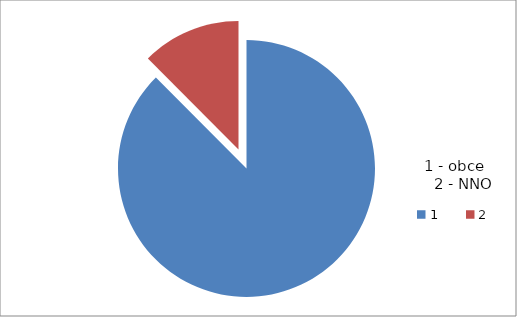
| Category | Series 0 |
|---|---|
| 0 | 87.544 |
| 1 | 12.456 |